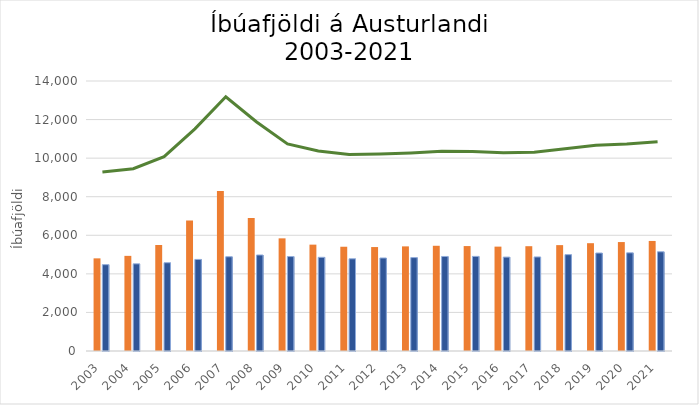
| Category | Karlar | Konur |
|---|---|---|
| 2003.0 | 4804 | 4476 |
| 2004.0 | 4933 | 4520 |
| 2005.0 | 5497 | 4576 |
| 2006.0 | 6768 | 4748 |
| 2007.0 | 8298 | 4887 |
| 2008.0 | 6900 | 4977 |
| 2009.0 | 5841 | 4896 |
| 2010.0 | 5515 | 4858 |
| 2011.0 | 5406 | 4781 |
| 2012.0 | 5390 | 4823 |
| 2013.0 | 5425 | 4843 |
| 2014.0 | 5456 | 4901 |
| 2015.0 | 5441 | 4905 |
| 2016.0 | 5412 | 4869 |
| 2017.0 | 5434 | 4876 |
| 2018.0 | 5490 | 4995 |
| 2019.0 | 5590 | 5080 |
| 2020.0 | 5649 | 5090 |
| 2021.0 | 5706 | 5144 |